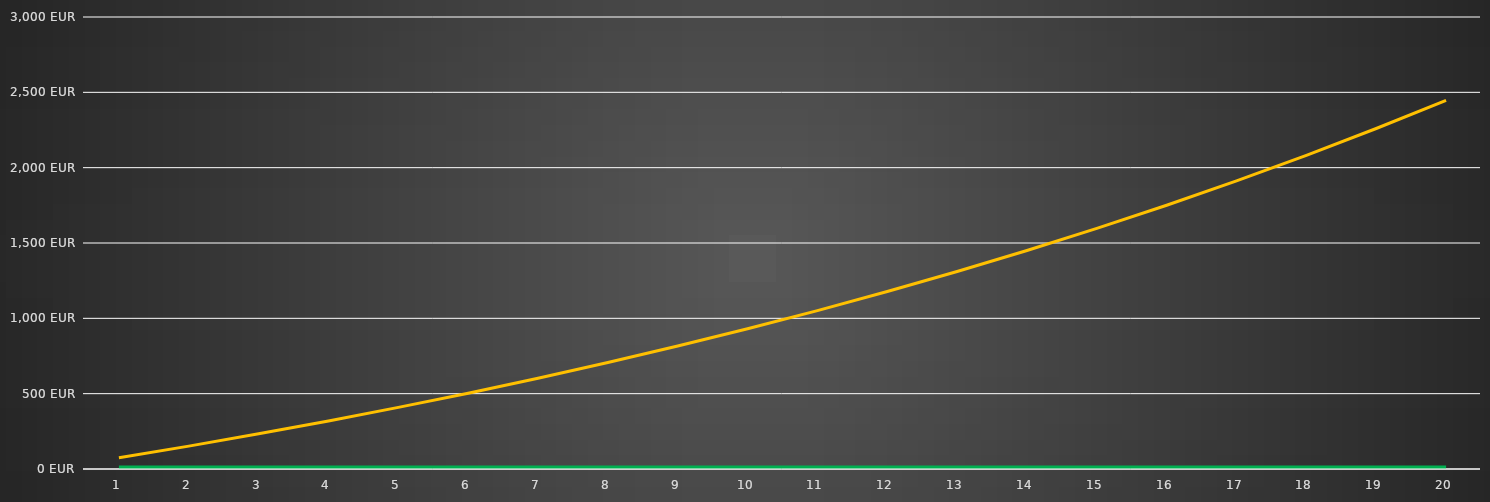
| Category | Series 0 | Series 1 |
|---|---|---|
| 0 | 74 | 0 |
| 1 | 151.7 | 0 |
| 2 | 233.285 | 0 |
| 3 | 318.949 | 0 |
| 4 | 408.897 | 0 |
| 5 | 503.342 | 0 |
| 6 | 602.509 | 0 |
| 7 | 706.634 | 0 |
| 8 | 815.966 | 0 |
| 9 | 930.764 | 0 |
| 10 | 1051.302 | 0 |
| 11 | 1177.867 | 0 |
| 12 | 1310.761 | 0 |
| 13 | 1450.299 | 0 |
| 14 | 1596.814 | 0 |
| 15 | 1750.654 | 0 |
| 16 | 1912.187 | 0 |
| 17 | 2081.796 | 0 |
| 18 | 2259.886 | 0 |
| 19 | 2446.881 | 0 |